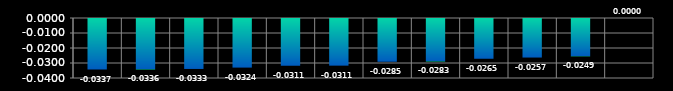
| Category | Series 0 |
|---|---|
| 0 | -0.034 |
| 1 | -0.034 |
| 2 | -0.033 |
| 3 | -0.032 |
| 4 | -0.031 |
| 5 | -0.031 |
| 6 | -0.028 |
| 7 | -0.028 |
| 8 | -0.026 |
| 9 | -0.026 |
| 10 | -0.025 |
| 11 | 0 |